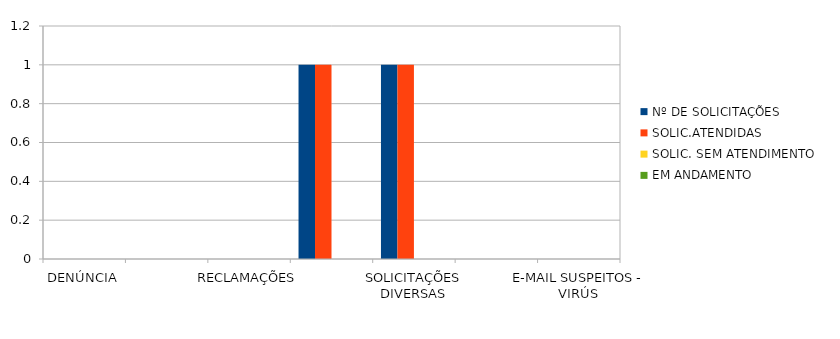
| Category | Nº DE SOLICITAÇÕES | SOLIC.ATENDIDAS | SOLIC. SEM ATENDIMENTO | EM ANDAMENTO |
|---|---|---|---|---|
| DENÚNCIA | 0 | 0 | 0 | 0 |
| DÚVIDA | 0 | 0 | 0 | 0 |
| RECLAMAÇÕES | 0 | 0 | 0 | 0 |
| PEDIDO DE ACESSO À INFORMAÇÃO | 1 | 1 | 0 | 0 |
| SOLICITAÇÕES DIVERSAS | 1 | 1 | 0 | 0 |
| SUGESTÃO  | 0 | 0 | 0 | 0 |
| E-MAIL SUSPEITOS - VIRÚS | 0 | 0 | 0 | 0 |